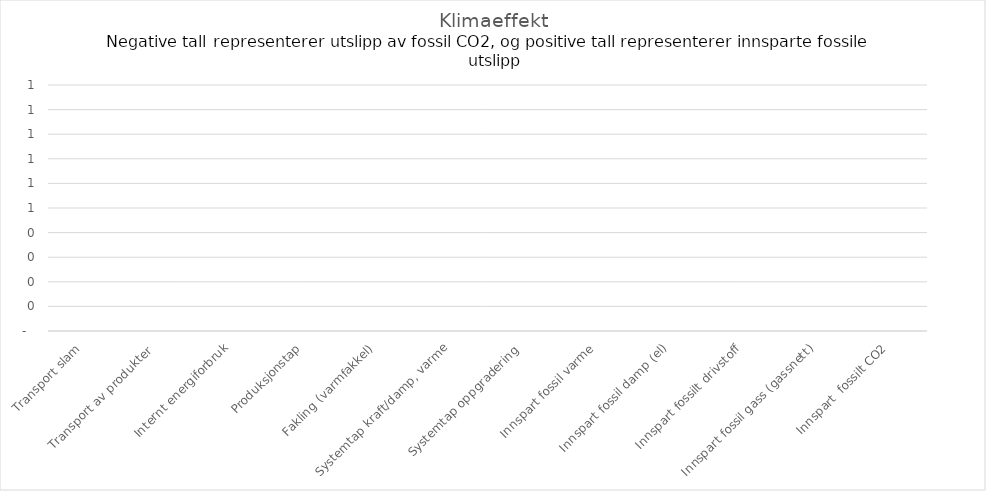
| Category | Series 0 |
|---|---|
| Transport slam | 0 |
| Transport av produkter  | 0 |
| Internt energiforbruk | 0 |
| Produksjonstap | 0 |
| Fakling (varmfakkel) | 0 |
| Systemtap kraft/damp, varme | 0 |
| Systemtap oppgradering  | 0 |
| Innspart fossil varme | 0 |
| Innspart fossil damp (el) | 0 |
| Innspart fossilt drivstoff | 0 |
| Innspart fossil gass (gassnett) | 0 |
| Innspart  fossilt CO2 | 0 |